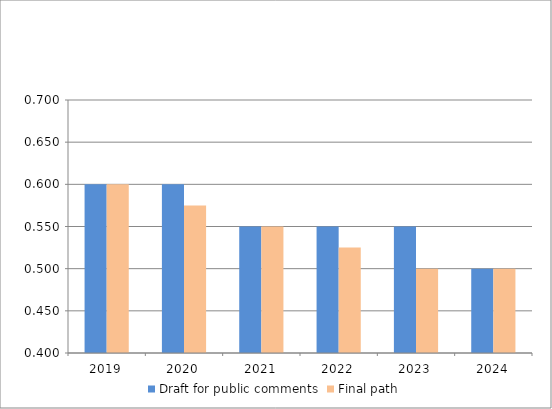
| Category | Draft for public comments | Final path |
|---|---|---|
| 2019.0 | 0.6 | 0.6 |
| 2020.0 | 0.6 | 0.575 |
| 2021.0 | 0.55 | 0.55 |
| 2022.0 | 0.55 | 0.525 |
| 2023.0 | 0.55 | 0.5 |
| 2024.0 | 0.5 | 0.5 |